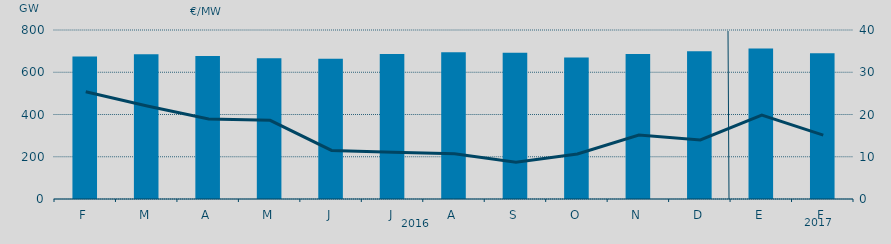
| Category | Energia (MWh) a subir |
|---|---|
| F | 675.142 |
| M | 685.406 |
| A | 677.215 |
| M | 666.328 |
| J | 664.292 |
| J | 686.788 |
| A | 694.56 |
| S | 691.889 |
| O | 669.591 |
| N | 686.044 |
| D | 698.836 |
| E | 712.52 |
| F | 690.067 |